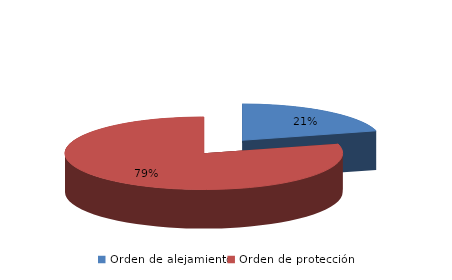
| Category | Series 0 |
|---|---|
| Orden de alejamiento | 42 |
| Orden de protección | 160 |